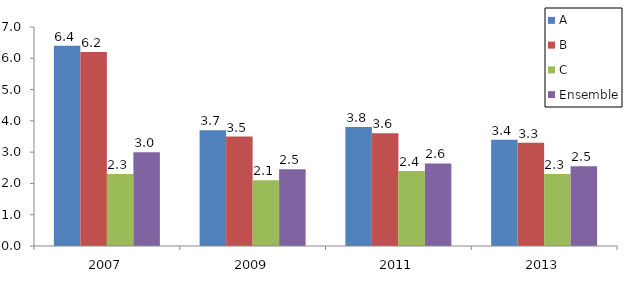
| Category | A | B | C | Ensemble |
|---|---|---|---|---|
| 2007.0 | 6.4 | 6.2 | 2.3 | 3 |
| 2009.0 | 3.7 | 3.5 | 2.1 | 2.45 |
| 2011.0 | 3.8 | 3.6 | 2.4 | 2.64 |
| 2013.0 | 3.4 | 3.3 | 2.3 | 2.55 |